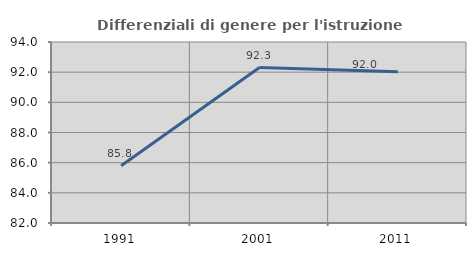
| Category | Differenziali di genere per l'istruzione superiore |
|---|---|
| 1991.0 | 85.796 |
| 2001.0 | 92.308 |
| 2011.0 | 92.034 |